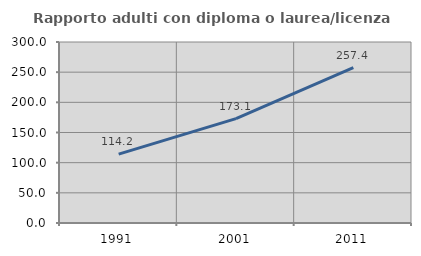
| Category | Rapporto adulti con diploma o laurea/licenza media  |
|---|---|
| 1991.0 | 114.234 |
| 2001.0 | 173.101 |
| 2011.0 | 257.418 |